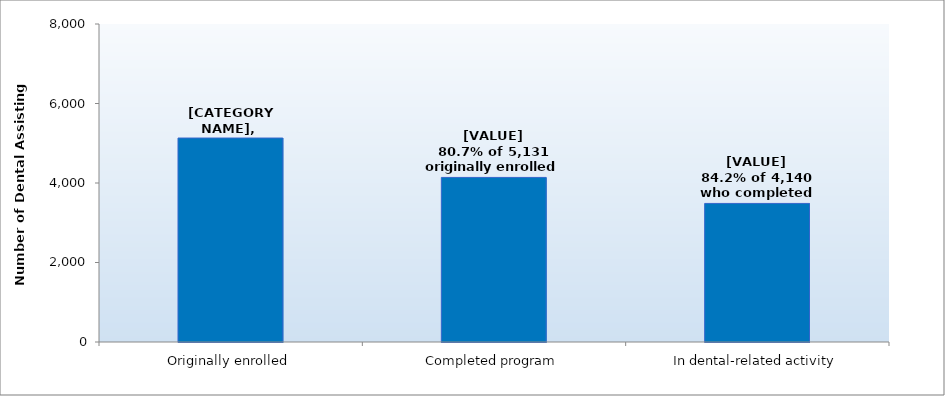
| Category | Series 0 |
|---|---|
| Originally enrolled | 5131 |
| Completed program | 4140 |
| In dental-related activity | 3486 |